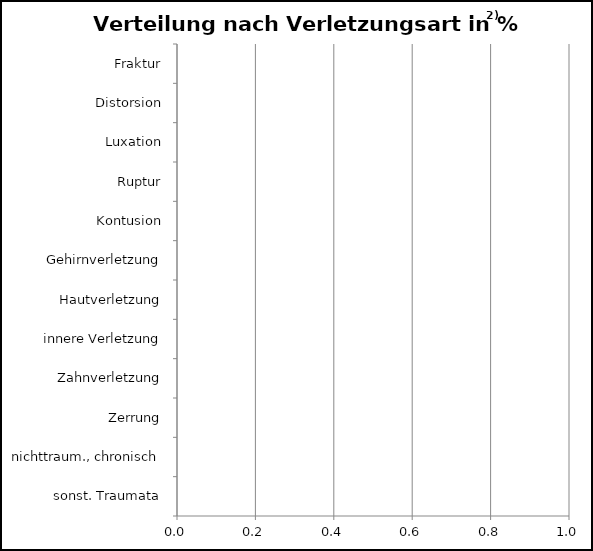
| Category | Series 0 |
|---|---|
| sonst. Traumata | 0 |
| nichttraum., chronisch | 0 |
| Zerrung | 0 |
| Zahnverletzung | 0 |
| innere Verletzung | 0 |
| Hautverletzung | 0 |
| Gehirnverletzung | 0 |
| Kontusion | 0 |
| Ruptur | 0 |
| Luxation | 0 |
| Distorsion | 0 |
| Fraktur | 0 |